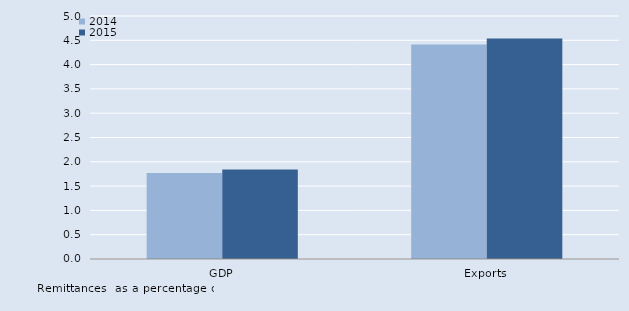
| Category | 2014 | 2015 |
|---|---|---|
| GDP | 1.768 | 1.84 |
| Exports | 4.413 | 4.537 |